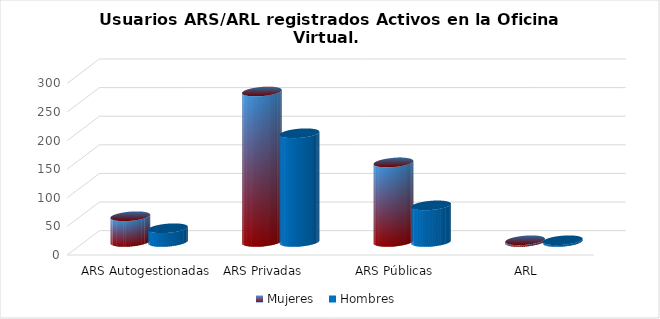
| Category | Mujeres | Hombres |
|---|---|---|
| ARS Autogestionadas | 45 | 24 |
| ARS Privadas | 263 | 190 |
| ARS Públicas | 139 | 64 |
| ARL | 3 | 3 |